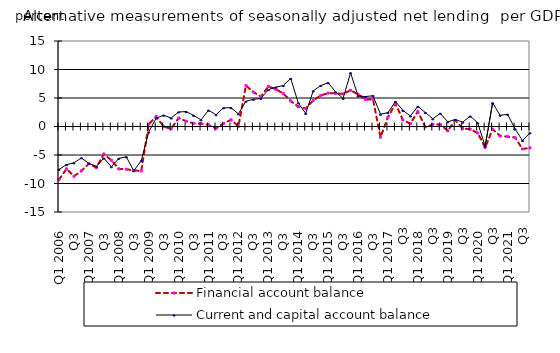
| Category | Financial account balance  | Current and capital account balance |
|---|---|---|
| Q1 2006 | -9.32 | -7.525 |
| Q2  | -7.43 | -6.704 |
| Q3  | -8.731 | -6.372 |
| Q4  | -7.776 | -5.5 |
| Q1 2007 | -6.51 | -6.489 |
| Q2  | -7.211 | -6.984 |
| Q3  | -4.827 | -5.556 |
| Q4  | -5.922 | -7.056 |
| Q1 2008 | -7.436 | -5.596 |
| Q2  | -7.493 | -5.322 |
| Q3  | -7.688 | -7.769 |
| Q4  | -7.814 | -6.013 |
| Q1 2009 | 0.395 | -0.979 |
| Q2  | 1.784 | 1.465 |
| Q3  | -0.028 | 1.974 |
| Q4  | -0.402 | 1.493 |
| Q1 2010 | 1.488 | 2.542 |
| Q2  | 0.928 | 2.622 |
| Q3  | 0.56 | 1.956 |
| Q4  | 0.496 | 1.162 |
| Q1 2011 | 0.291 | 2.85 |
| Q2  | -0.35 | 2.064 |
| Q3  | 0.55 | 3.275 |
| Q4  | 1.16 | 3.296 |
| Q1 2012 | 0.025 | 2.22 |
| Q2  | 7.186 | 4.422 |
| Q3  | 6.051 | 4.772 |
| Q4  | 5.255 | 4.924 |
| Q1 2013 | 7.028 | 6.459 |
| Q2  | 6.531 | 6.899 |
| Q3  | 5.798 | 7.193 |
| Q4  | 4.465 | 8.439 |
| Q1 2014 | 3.477 | 4.14 |
| Q2  | 3.189 | 2.29 |
| Q3  | 4.564 | 6.24 |
| Q4  | 5.443 | 7.18 |
| Q1 2015 | 5.864 | 7.681 |
| Q2  | 5.809 | 6.071 |
| Q3  | 5.724 | 4.936 |
| Q4 | 6.356 | 9.424 |
| Q1 2016 | 5.648 | 5.36 |
| Q2  | 4.73 | 5.252 |
| Q3  | 4.768 | 5.399 |
| Q4 | -1.879 | 2.151 |
| Q1 2017 | 1.631 | 2.445 |
| Q2  | 4.014 | 4.384 |
| Q3 | 1.142 | 2.839 |
| Q4 | 0.504 | 1.844 |
| Q1 2018 | 2.644 | 3.53 |
| Q2  | -0.081 | 2.456 |
| Q3 | 0.36 | 1.347 |
| Q4 | 0.368 | 2.305 |
| Q1 2019 | -0.757 | 0.824 |
| Q2  | 1.075 | 1.224 |
| Q3 | -0.345 | 0.76 |
| Q4 | -0.473 | 1.821 |
| Q1 2020 | -1.127 | 0.657 |
| Q2  | -3.7 | -3.458 |
| Q3 | -0.482 | 4.147 |
| Q4 | -1.658 | 1.962 |
| Q1 2021 | -1.784 | 2.137 |
| Q2  | -1.928 | -0.412 |
| Q3 | -3.95 | -2.459 |
| Q4 | -3.749 | -1.111 |